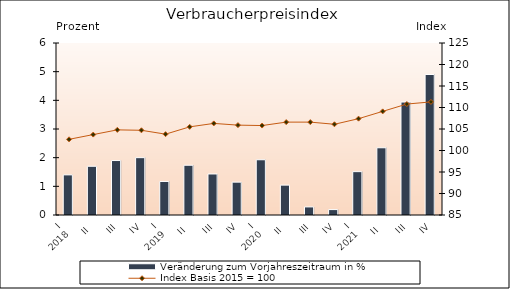
| Category | Veränderung zum Vorjahreszeitraum in % |
|---|---|
| 0 | 1.4 |
| 1 | 1.7 |
| 2 | 1.9 |
| 3 | 2 |
| 4 | 1.17 |
| 5 | 1.736 |
| 6 | 1.431 |
| 7 | 1.146 |
| 8 | 1.927 |
| 9 | 1.043 |
| 10 | 0.282 |
| 11 | 0.189 |
| 12 | 1.512 |
| 13 | 2.345 |
| 14 | 3.94 |
| 15 | 4.901 |